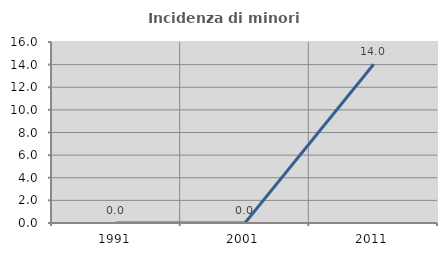
| Category | Incidenza di minori stranieri |
|---|---|
| 1991.0 | 0 |
| 2001.0 | 0 |
| 2011.0 | 14.035 |